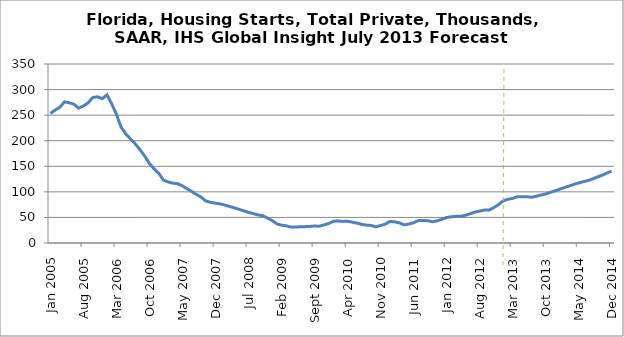
| Category | Series 0 |
|---|---|
| 2005-01-01 | 253.384 |
| 2005-02-01 | 259.839 |
| 2005-03-01 | 265.297 |
| 2005-04-01 | 275.939 |
| 2005-05-01 | 274.35 |
| 2005-06-01 | 271.369 |
| 2005-07-01 | 263.859 |
| 2005-08-01 | 267.715 |
| 2005-09-01 | 274.029 |
| 2005-10-01 | 284.39 |
| 2005-11-01 | 285.963 |
| 2005-12-01 | 282.075 |
| 2006-01-01 | 289.783 |
| 2006-02-01 | 272.241 |
| 2006-03-01 | 251.647 |
| 2006-04-01 | 226.47 |
| 2006-05-01 | 213.164 |
| 2006-06-01 | 203.438 |
| 2006-07-01 | 193.786 |
| 2006-08-01 | 182.414 |
| 2006-09-01 | 169.745 |
| 2006-10-01 | 155.669 |
| 2006-11-01 | 144.778 |
| 2006-12-01 | 136.038 |
| 2007-01-01 | 122.814 |
| 2007-02-01 | 119.259 |
| 2007-03-01 | 116.985 |
| 2007-04-01 | 115.981 |
| 2007-05-01 | 111.611 |
| 2007-06-01 | 105.932 |
| 2007-07-01 | 100.654 |
| 2007-08-01 | 94.675 |
| 2007-09-01 | 89.45 |
| 2007-10-01 | 81.94 |
| 2007-11-01 | 79.447 |
| 2007-12-01 | 77.816 |
| 2008-01-01 | 76.442 |
| 2008-02-01 | 74.165 |
| 2008-03-01 | 71.353 |
| 2008-04-01 | 68.792 |
| 2008-05-01 | 65.812 |
| 2008-06-01 | 62.99 |
| 2008-07-01 | 59.964 |
| 2008-08-01 | 57.554 |
| 2008-09-01 | 54.88 |
| 2008-10-01 | 53.582 |
| 2008-11-01 | 48.992 |
| 2008-12-01 | 44.101 |
| 2009-01-01 | 37.371 |
| 2009-02-01 | 34.832 |
| 2009-03-01 | 33.666 |
| 2009-04-01 | 31.02 |
| 2009-05-01 | 31.24 |
| 2009-06-01 | 31.706 |
| 2009-07-01 | 31.933 |
| 2009-08-01 | 32.429 |
| 2009-09-01 | 33.234 |
| 2009-10-01 | 32.808 |
| 2009-11-01 | 35.316 |
| 2009-12-01 | 38.037 |
| 2010-01-01 | 42.525 |
| 2010-02-01 | 42.986 |
| 2010-03-01 | 42.204 |
| 2010-04-01 | 42.569 |
| 2010-05-01 | 40.748 |
| 2010-06-01 | 38.864 |
| 2010-07-01 | 36.372 |
| 2010-08-01 | 34.969 |
| 2010-09-01 | 34.427 |
| 2010-10-01 | 31.591 |
| 2010-11-01 | 34.08 |
| 2010-12-01 | 36.895 |
| 2011-01-01 | 42.19 |
| 2011-02-01 | 41.311 |
| 2011-03-01 | 39.446 |
| 2011-04-01 | 35.466 |
| 2011-05-01 | 36.975 |
| 2011-06-01 | 39.697 |
| 2011-07-01 | 43.703 |
| 2011-08-01 | 44.038 |
| 2011-09-01 | 43.528 |
| 2011-10-01 | 41.534 |
| 2011-11-01 | 43.426 |
| 2011-12-01 | 46.271 |
| 2012-01-01 | 49.818 |
| 2012-02-01 | 51.23 |
| 2012-03-01 | 52.081 |
| 2012-04-01 | 52.061 |
| 2012-05-01 | 54.363 |
| 2012-06-01 | 57.227 |
| 2012-07-01 | 60.397 |
| 2012-08-01 | 62.338 |
| 2012-09-01 | 64.34 |
| 2012-10-01 | 64.267 |
| 2012-11-01 | 69.176 |
| 2012-12-01 | 74.849 |
| 2013-01-01 | 82.313 |
| 2013-02-01 | 85.543 |
| 2013-03-01 | 87.196 |
| 2013-04-01 | 90.401 |
| 2013-05-01 | 90.481 |
| 2013-06-01 | 90.616 |
| 2013-07-01 | 89.385 |
| 2013-08-01 | 91.217 |
| 2013-09-01 | 93.864 |
| 2013-10-01 | 95.905 |
| 2013-11-01 | 99.02 |
| 2013-12-01 | 102.132 |
| 2014-01-01 | 105.287 |
| 2014-02-01 | 108.383 |
| 2014-03-01 | 111.398 |
| 2014-04-01 | 114.658 |
| 2014-05-01 | 117.317 |
| 2014-06-01 | 119.978 |
| 2014-07-01 | 122.066 |
| 2014-08-01 | 125.422 |
| 2014-09-01 | 129.167 |
| 2014-10-01 | 132.539 |
| 2014-11-01 | 136.705 |
| 2014-12-01 | 140.781 |